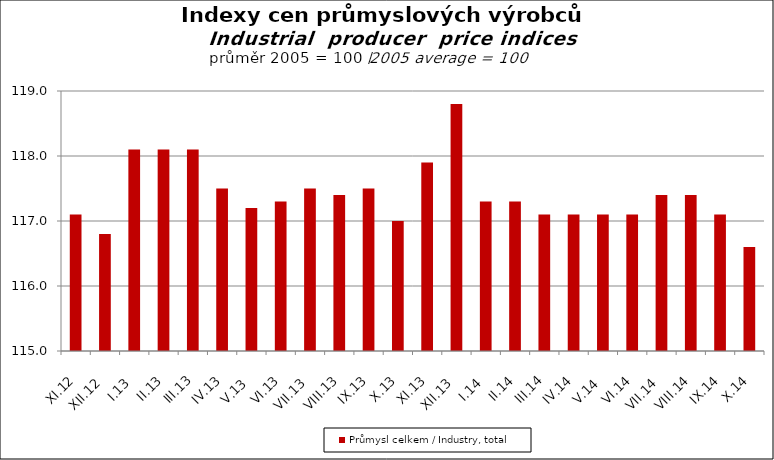
| Category | Průmysl celkem / Industry, total |
|---|---|
| XI.12 | 117.1 |
| XII.12 | 116.8 |
| I.13 | 118.1 |
| II.13 | 118.1 |
| III.13 | 118.1 |
| IV.13 | 117.5 |
| V.13 | 117.2 |
| VI.13 | 117.3 |
| VII.13 | 117.5 |
| VIII.13 | 117.4 |
| IX.13 | 117.5 |
| X.13 | 117 |
| XI.13 | 117.9 |
| XII.13 | 118.8 |
| I.14 | 117.3 |
| II.14 | 117.3 |
| III.14 | 117.1 |
| IV.14 | 117.1 |
| V.14 | 117.1 |
| VI.14 | 117.1 |
| VII.14 | 117.4 |
| VIII.14 | 117.4 |
| IX.14 | 117.1 |
| X.14 | 116.6 |